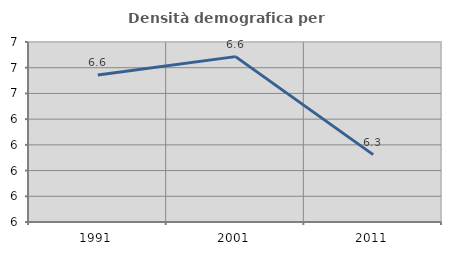
| Category | Densità demografica |
|---|---|
| 1991.0 | 6.572 |
| 2001.0 | 6.643 |
| 2011.0 | 6.262 |